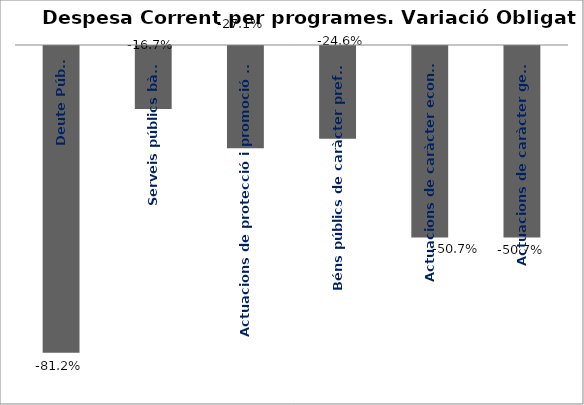
| Category | Series 0 |
|---|---|
| Deute Públic | -0.812 |
| Serveis públics bàsics | -0.167 |
| Actuacions de protecció i promoció social | -0.271 |
| Béns públics de caràcter preferent | -0.246 |
| Actuacions de caràcter econòmic | -0.507 |
| Actuacions de caràcter general | -0.507 |